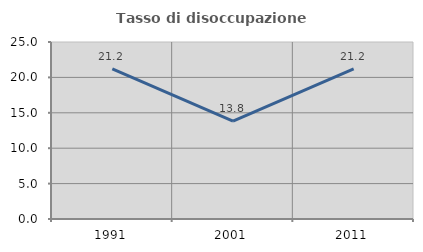
| Category | Tasso di disoccupazione giovanile  |
|---|---|
| 1991.0 | 21.207 |
| 2001.0 | 13.828 |
| 2011.0 | 21.201 |